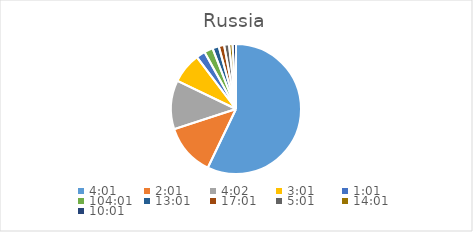
| Category | Series 0 |
|---|---|
| 0.1673611111111111 | 79.057 |
| 0.08402777777777777 | 17.782 |
| 0.16805555555555554 | 16.811 |
| 0.12569444444444444 | 10.516 |
| 0.042361111111111106 | 3.097 |
| 4.334027777777778 | 2.994 |
| 0.5423611111111112 | 2.194 |
| 0.7090277777777777 | 1.872 |
| 0.20902777777777778 | 1.689 |
| 0.5840277777777778 | 1.206 |
| 0.4173611111111111 | 1.167 |